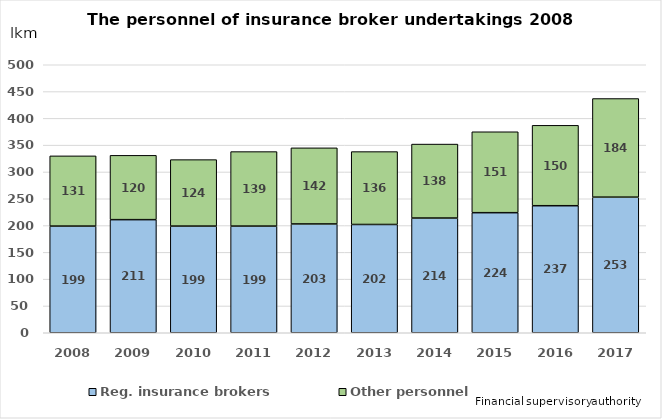
| Category | Reg. insurance brokers | Other personnel |
|---|---|---|
| 2008.0 | 199 | 131 |
| 2009.0 | 211 | 120 |
| 2010.0 | 199 | 124 |
| 2011.0 | 199 | 139 |
| 2012.0 | 203 | 142 |
| 2013.0 | 202 | 136 |
| 2014.0 | 214 | 138 |
| 2015.0 | 224 | 151 |
| 2016.0 | 237 | 150 |
| 2017.0 | 253 | 184 |